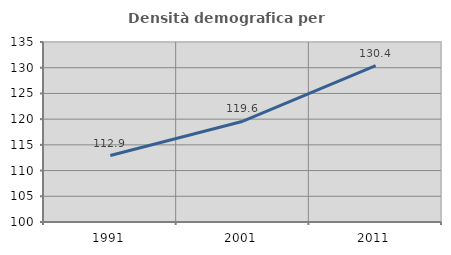
| Category | Densità demografica |
|---|---|
| 1991.0 | 112.927 |
| 2001.0 | 119.596 |
| 2011.0 | 130.393 |